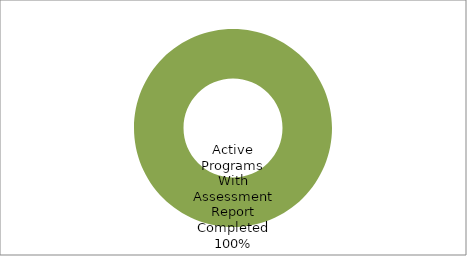
| Category | Series 0 |
|---|---|
| Active Programs With Assessment Report Completed | 52 |
| Active Programs Without Assessment Report | 0 |